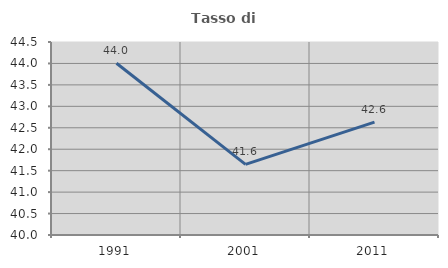
| Category | Tasso di occupazione   |
|---|---|
| 1991.0 | 44.004 |
| 2001.0 | 41.646 |
| 2011.0 | 42.633 |